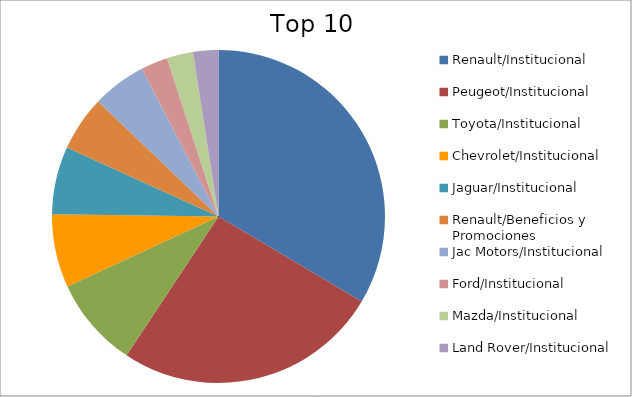
| Category | Series 0 |
|---|---|
| Renault/Institucional | 31.39 |
| Peugeot/Institucional | 24.13 |
| Toyota/Institucional | 8.24 |
| Chevrolet/Institucional | 6.65 |
| Jaguar/Institucional | 6.16 |
| Renault/Beneficios y Promociones | 5.02 |
| Jac Motors/Institucional | 4.9 |
| Ford/Institucional | 2.45 |
| Mazda/Institucional | 2.38 |
| Land Rover/Institucional | 2.3 |